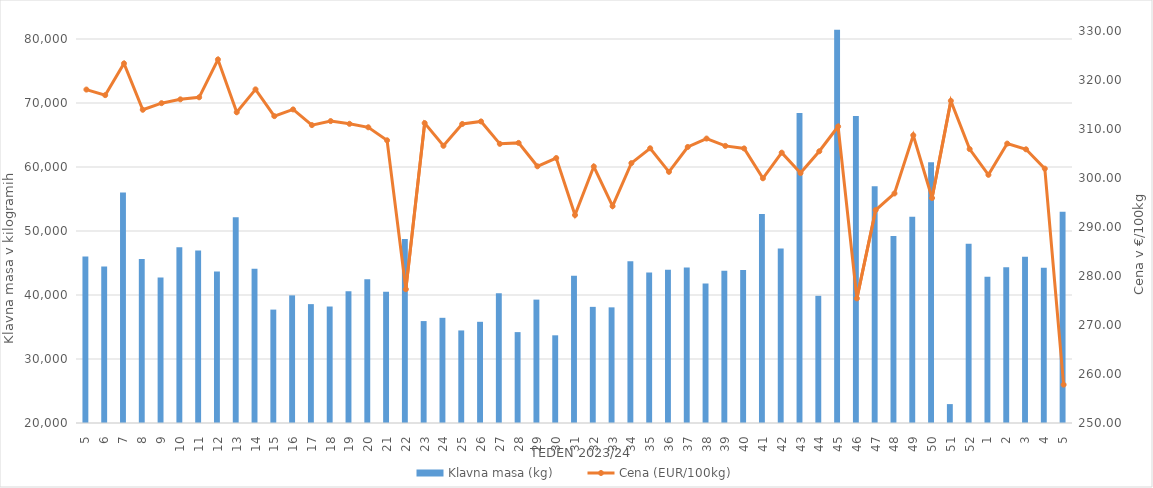
| Category | Klavna masa (kg) |
|---|---|
| 5.0 | 46011 |
| 6.0 | 44439 |
| 7.0 | 56001 |
| 8.0 | 45613 |
| 9.0 | 42730 |
| 10.0 | 47471 |
| 11.0 | 46952 |
| 12.0 | 43683 |
| 13.0 | 52135 |
| 14.0 | 44103 |
| 15.0 | 37719 |
| 16.0 | 39943 |
| 17.0 | 38574 |
| 18.0 | 38200 |
| 19.0 | 40581 |
| 20.0 | 42443 |
| 21.0 | 40517 |
| 22.0 | 48742 |
| 23.0 | 35927 |
| 24.0 | 36436 |
| 25.0 | 34463 |
| 26.0 | 35812 |
| 27.0 | 40280 |
| 28.0 | 34201 |
| 29.0 | 39279 |
| 30.0 | 33702 |
| 31.0 | 43020 |
| 32.0 | 38146 |
| 33.0 | 38070 |
| 34.0 | 45290 |
| 35.0 | 43513 |
| 36.0 | 43945 |
| 37.0 | 44302 |
| 38.0 | 41798 |
| 39.0 | 43790 |
| 40.0 | 43913 |
| 41.0 | 52663 |
| 42.0 | 47275 |
| 43.0 | 68419 |
| 44.0 | 39872 |
| 45.0 | 81439 |
| 46.0 | 67983 |
| 47.0 | 57006 |
| 48.0 | 49204 |
| 49.0 | 52219 |
| 50.0 | 60759 |
| 51.0 | 22954 |
| 52.0 | 48002 |
| 1.0 | 42866 |
| 2.0 | 44318 |
| 3.0 | 45969 |
| 4.0 | 44266 |
| 5.0 | 52991 |